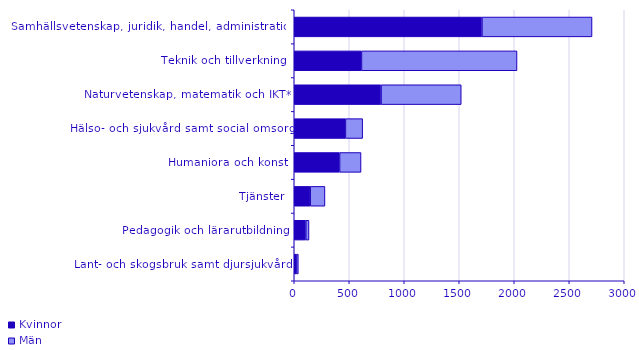
| Category | Kvinnor | Män |
|---|---|---|
| Lant- och skogsbruk samt djursjukvård | 20 | 17 |
| Pedagogik och lärarutbildning | 105 | 29 |
| Tjänster | 145 | 134 |
| Humaniora och konst | 412 | 195 |
| Hälso- och sjukvård samt social omsorg | 465 | 157 |
| Naturvetenskap, matematik och IKT* | 789 | 729 |
| Teknik och tillverkning | 611 | 1414 |
| Samhällsvetenskap, juridik, handel, administration | 1706 | 1001 |